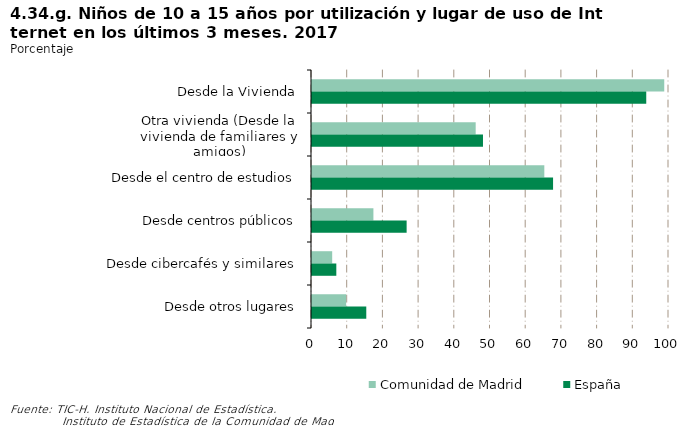
| Category | Comunidad de Madrid | España |
|---|---|---|
| Desde la Vivienda | 98.67 | 93.627 |
| Otra vivienda (Desde la vivienda de familiares y amigos) | 45.849 | 47.895 |
| Desde el centro de estudios | 65.076 | 67.526 |
| Desde centros públicos | 17.201 | 26.508 |
| Desde cibercafés y similares | 5.656 | 6.813 |
| Desde otros lugares | 9.563 | 15.204 |